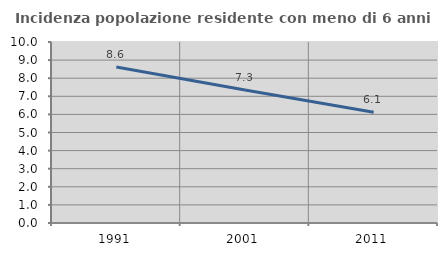
| Category | Incidenza popolazione residente con meno di 6 anni |
|---|---|
| 1991.0 | 8.614 |
| 2001.0 | 7.346 |
| 2011.0 | 6.118 |